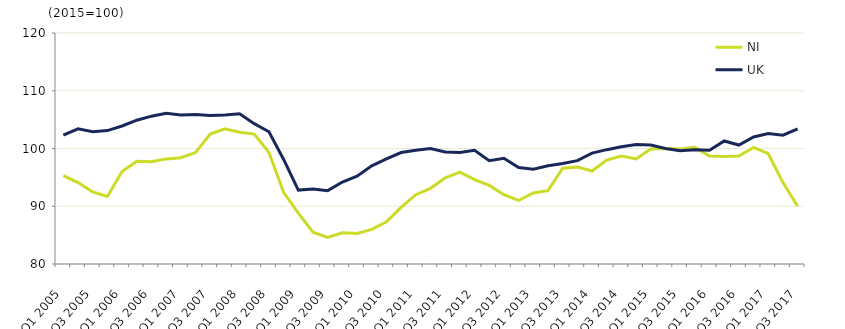
| Category | NI  | UK  |
|---|---|---|
| Q1 2005 | 95.3 | 102.3 |
|  | 94.1 | 103.4 |
| Q3 2005 | 92.5 | 102.9 |
|  | 91.7 | 103.1 |
| Q1 2006 | 96 | 103.9 |
|  | 97.8 | 104.9 |
| Q3 2006 | 97.7 | 105.6 |
|  | 98.2 | 106.1 |
| Q1 2007 | 98.4 | 105.8 |
|  | 99.3 | 105.9 |
| Q3 2007 | 102.5 | 105.7 |
|  | 103.4 | 105.8 |
| Q1 2008 | 102.8 | 106 |
|  | 102.5 | 104.3 |
| Q3 2008 | 99.3 | 102.9 |
|  | 92.4 | 98.1 |
| Q1 2009 | 88.8 | 92.8 |
|  | 85.5 | 93 |
| Q3 2009 | 84.6 | 92.7 |
|  | 85.4 | 94.2 |
| Q1 2010 | 85.3 | 95.2 |
|  | 86 | 97 |
| Q3 2010 | 87.3 | 98.2 |
|  | 89.8 | 99.3 |
| Q1 2011 | 92 | 99.7 |
|  | 93.1 | 100 |
| Q3 2011 | 94.9 | 99.4 |
|  | 95.9 | 99.3 |
| Q1 2012 | 94.6 | 99.7 |
|  | 93.6 | 97.9 |
| Q3 2012 | 92 | 98.3 |
|  | 91 | 96.7 |
| Q1 2013 | 92.3 | 96.4 |
|  | 92.7 | 97 |
| Q3 2013 | 96.6 | 97.4 |
|  | 96.8 | 97.9 |
| Q1 2014 | 96.1 | 99.2 |
|  | 98 | 99.8 |
| Q3 2014 | 98.7 | 100.3 |
|  | 98.2 | 100.7 |
| Q1 2015 | 99.9 | 100.6 |
|  | 100 | 100 |
| Q3 2015 | 99.9 | 99.6 |
|  | 100.2 | 99.8 |
| Q1 2016 | 98.7 | 99.7 |
|  | 98.6 | 101.3 |
| Q3 2016 | 98.7 | 100.6 |
|  | 100.2 | 102 |
| Q1 2017 | 99.1 | 102.6 |
|  | 94.1 | 102.3 |
| Q3 2017 | 90 | 103.4 |